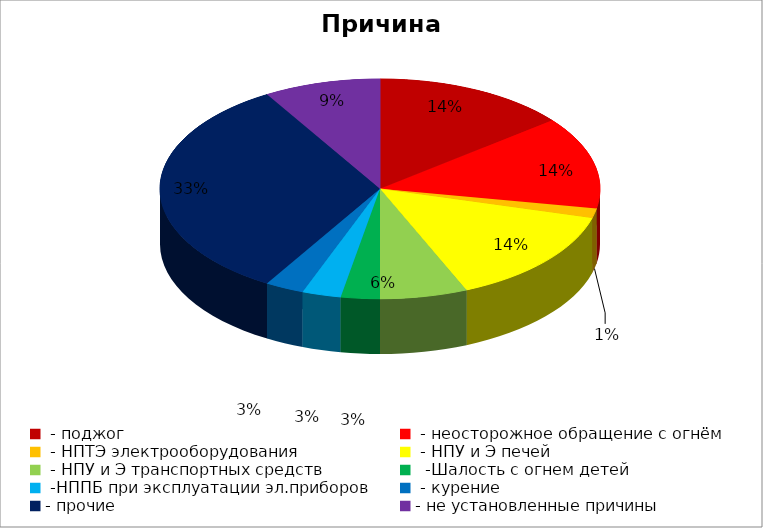
| Category | Причина пожара |
|---|---|
|  - поджог | 20 |
|  - неосторожное обращение с огнём | 19 |
|  - НПТЭ электрооборудования | 2 |
|  - НПУ и Э печей | 20 |
|  - НПУ и Э транспортных средств | 9 |
|   -Шалость с огнем детей | 4 |
|  -НППБ при эксплуатации эл.приборов | 4 |
|  - курение | 4 |
| - прочие | 46 |
| - не установленные причины | 12 |